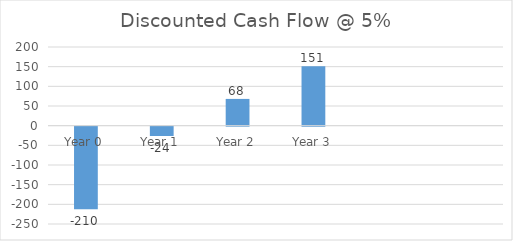
| Category | Series 0 |
|---|---|
| Year 0 | -210 |
| Year 1 | -23.8 |
| Year 2 | 68.025 |
| Year 3 | 151.2 |